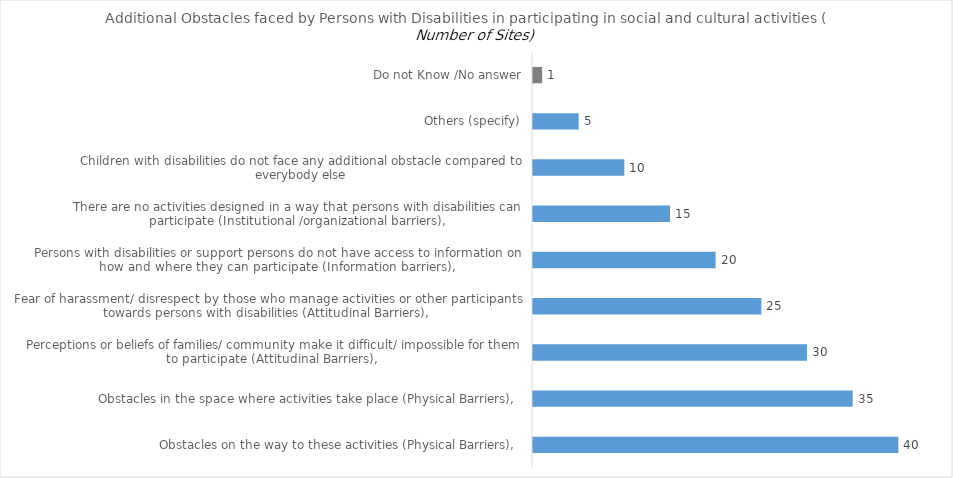
| Category | Additional Obstacles faced by Persons with Disabilities in participating in social and cultural activities |
|---|---|
| Obstacles on the way to these activities (Physical Barriers),  | 40 |
| Obstacles in the space where activities take place (Physical Barriers),  | 35 |
| Perceptions or beliefs of families/ community make it difficult/ impossible for them to participate (Attitudinal Barriers),  | 30 |
| Fear of harassment/ disrespect by those who manage activities or other participants towards persons with disabilities (Attitudinal Barriers),  | 25 |
| Persons with disabilities or support persons do not have access to information on how and where they can participate (Information barriers),  | 20 |
| There are no activities designed in a way that persons with disabilities can participate (Institutional /organizational barriers), | 15 |
| Children with disabilities do not face any additional obstacle compared to everybody else | 10 |
| Others (specify) | 5 |
| Do not Know /No answer | 1 |